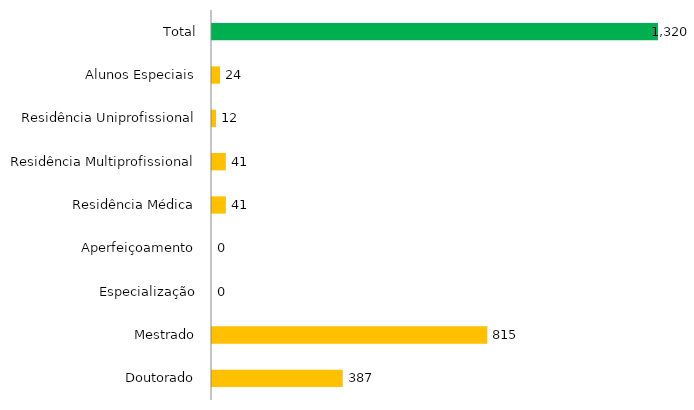
| Category | Pós - Graduação UFGD |
|---|---|
| Doutorado | 387 |
| Mestrado | 815 |
| Especialização | 0 |
| Aperfeiçoamento | 0 |
| Residência Médica | 41 |
| Residência Multiprofissional | 41 |
| Residência Uniprofissional | 12 |
| Alunos Especiais | 24 |
| Total | 1320 |